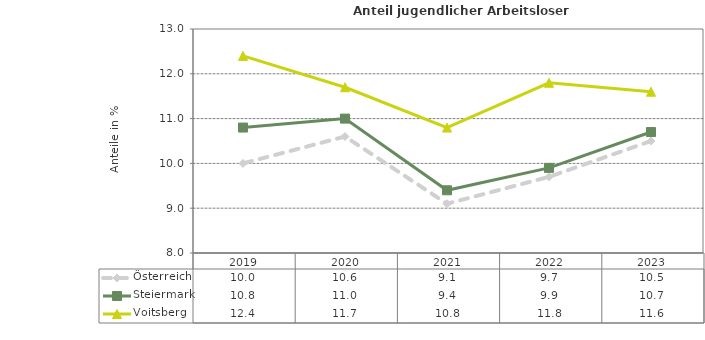
| Category | Österreich | Steiermark | Voitsberg |
|---|---|---|---|
| 2023.0 | 10.5 | 10.7 | 11.6 |
| 2022.0 | 9.7 | 9.9 | 11.8 |
| 2021.0 | 9.1 | 9.4 | 10.8 |
| 2020.0 | 10.6 | 11 | 11.7 |
| 2019.0 | 10 | 10.8 | 12.4 |